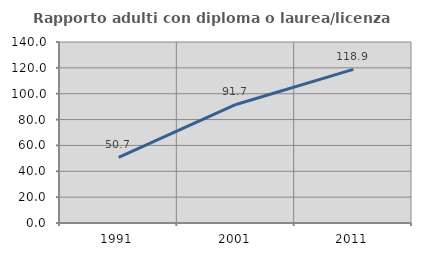
| Category | Rapporto adulti con diploma o laurea/licenza media  |
|---|---|
| 1991.0 | 50.681 |
| 2001.0 | 91.688 |
| 2011.0 | 118.864 |